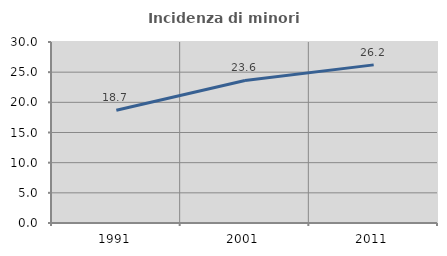
| Category | Incidenza di minori stranieri |
|---|---|
| 1991.0 | 18.681 |
| 2001.0 | 23.622 |
| 2011.0 | 26.21 |